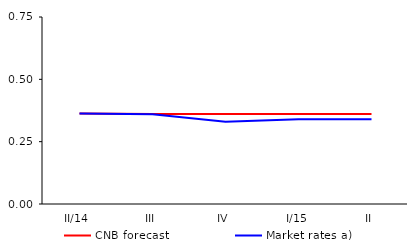
| Category | CNB forecast | Market rates a) |
|---|---|---|
| II/14 | 0.363 | 0.363 |
| III | 0.361 | 0.36 |
| IV | 0.361 | 0.33 |
| I/15 | 0.361 | 0.34 |
| II | 0.361 | 0.34 |